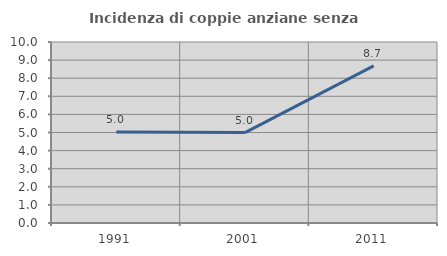
| Category | Incidenza di coppie anziane senza figli  |
|---|---|
| 1991.0 | 5.026 |
| 2001.0 | 4.994 |
| 2011.0 | 8.684 |